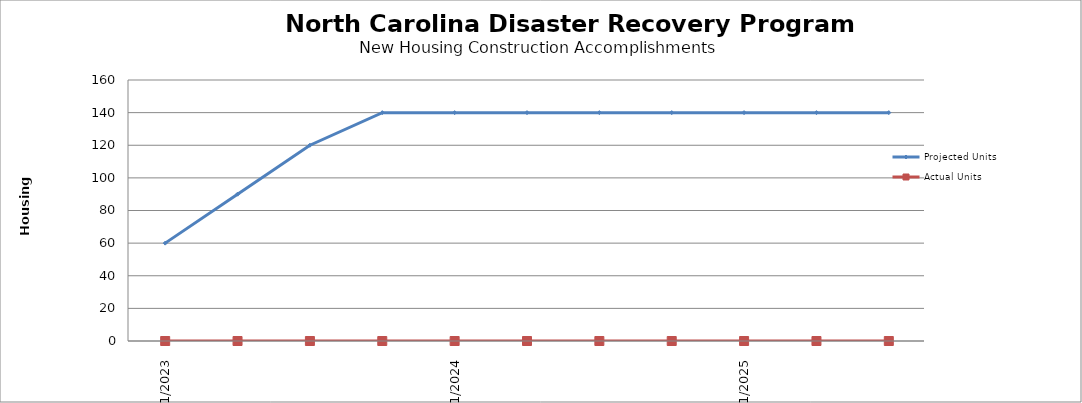
| Category | Projected Units | Actual Units |
|---|---|---|
| 01/2023 | 60 | 0 |
| 4/2023 | 90 | 0 |
| 07/2023 | 120 | 0 |
| 10/2023 | 140 | 0 |
| 01/2024 | 140 | 0 |
| 4/2024 | 140 | 0 |
| 07/2024 | 140 | 0 |
| 10/2024 | 140 | 0 |
| 01/2025 | 140 | 0 |
| 4/2025 | 140 | 0 |
| 07/2025 | 140 | 0 |